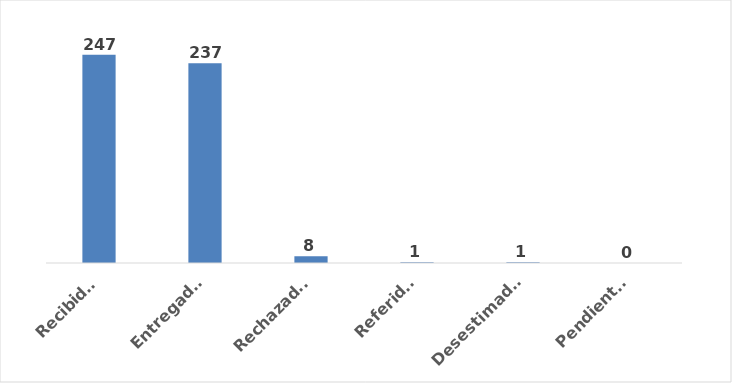
| Category | Series 0 |
|---|---|
| Recibidas | 247 |
| Entregadas | 237 |
| Rechazadas | 8 |
| Referidas | 1 |
| Desestimadas | 1 |
| Pendientes | 0 |